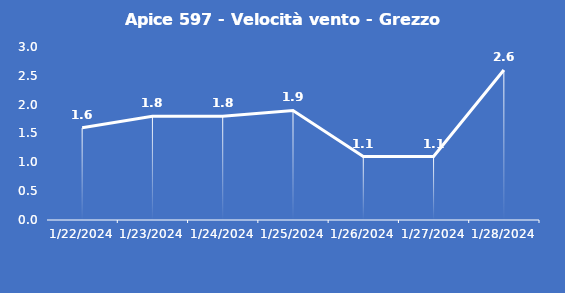
| Category | Apice 597 - Velocità vento - Grezzo (m/s) |
|---|---|
| 1/22/24 | 1.6 |
| 1/23/24 | 1.8 |
| 1/24/24 | 1.8 |
| 1/25/24 | 1.9 |
| 1/26/24 | 1.1 |
| 1/27/24 | 1.1 |
| 1/28/24 | 2.6 |